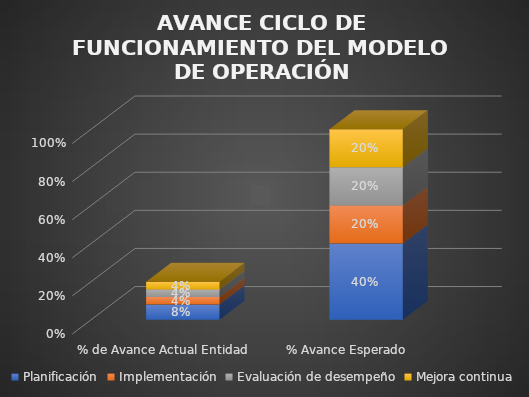
| Category | Planificación | Implementación | Evaluación de desempeño | Mejora continua |
|---|---|---|---|---|
| % de Avance Actual Entidad | 0.08 | 0.039 | 0.04 | 0.04 |
| % Avance Esperado | 0.4 | 0.2 | 0.2 | 0.2 |